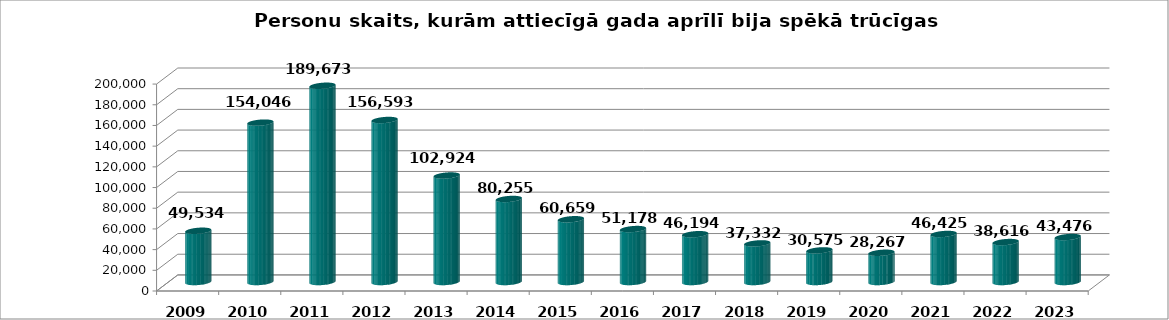
| Category | aprīlis |
|---|---|
| 2009.0 | 49534 |
| 2010.0 | 154046 |
| 2011.0 | 189673 |
| 2012.0 | 156593 |
| 2013.0 | 102924 |
| 2014.0 | 80255 |
| 2015.0 | 60659 |
| 2016.0 | 51178 |
| 2017.0 | 46194 |
| 2018.0 | 37332 |
| 2019.0 | 30575 |
| 2020.0 | 28267 |
| 2021.0 | 46425 |
| 2022.0 | 38616 |
| 2023.0 | 43476 |